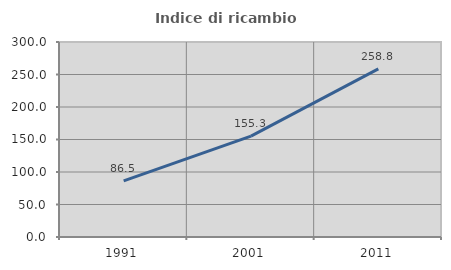
| Category | Indice di ricambio occupazionale  |
|---|---|
| 1991.0 | 86.466 |
| 2001.0 | 155.263 |
| 2011.0 | 258.75 |